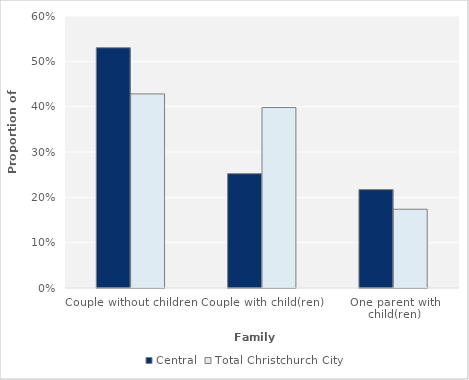
| Category | Central | Total Christchurch City |
|---|---|---|
| Couple without children | 0.53 | 0.428 |
| Couple with child(ren) | 0.252 | 0.398 |
| One parent with child(ren) | 0.217 | 0.174 |